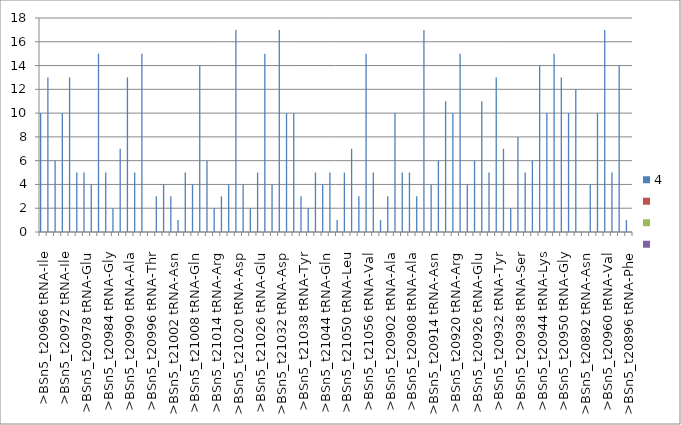
| Category | 4 | Series 1 | Series 2 | Series 3 |
|---|---|---|---|---|
| >BSn5_t20966 tRNA-Ile | 10 |  |  |  |
| >BSn5_t20968 tRNA-Ala | 13 |  |  |  |
| >BSn5_t20970 tRNA-Ser | 6 |  |  |  |
| >BSn5_t20972 tRNA-Ile | 10 |  |  |  |
| >BSn5_t20974 tRNA-Ala | 13 |  |  |  |
| >BSn5_t20976 tRNA-Met | 5 |  |  |  |
| >BSn5_t20978 tRNA-Glu | 5 |  |  |  |
| >BSn5_t20980 tRNA-Asn | 4 |  |  |  |
| >BSn5_t20982 tRNA-Thr | 15 |  |  |  |
| >BSn5_t20984 tRNA-Gly | 5 |  |  |  |
| >BSn5_t20986 tRNA-Arg | 2 |  |  |  |
| >BSn5_t20988 tRNA-Pro | 7 |  |  |  |
| >BSn5_t20990 tRNA-Ala | 13 |  |  |  |
| >BSn5_t20992 tRNA-Glu | 5 |  |  |  |
| >BSn5_t20994 tRNA-Val | 15 |  |  |  |
| >BSn5_t20996 tRNA-Thr | 0 |  |  |  |
| >BSn5_t20998 tRNA-Tyr | 3 |  |  |  |
| >BSn5_t21000 tRNA-Gln | 4 |  |  |  |
| >BSn5_t21002 tRNA-Asn | 3 |  |  |  |
| >BSn5_t21004 tRNA-Ser | 1 |  |  |  |
| >BSn5_t21006 tRNA-Glu | 5 |  |  |  |
| >BSn5_t21008 tRNA-Gln | 4 |  |  |  |
| >BSn5_t21010 tRNA-Lys | 14 |  |  |  |
| >BSn5_t21012 tRNA-Leu | 6 |  |  |  |
| >BSn5_t21014 tRNA-Arg | 2 |  |  |  |
| >BSn5_t21016 tRNA-Gly | 3 |  |  |  |
| >BSn5_t21018 tRNA-Met | 4 |  |  |  |
| >BSn5_t21020 tRNA-Asp | 17 |  |  |  |
| >BSn5_t21022 tRNA-Asn | 4 |  |  |  |
| >BSn5_t21024 tRNA-Ser | 2 |  |  |  |
| >BSn5_t21026 tRNA-Glu | 5 |  |  |  |
| >BSn5_t21028 tRNA-Val | 15 |  |  |  |
| >BSn5_t21030 tRNA-Met | 4 |  |  |  |
| >BSn5_t21032 tRNA-Asp | 17 |  |  |  |
| >BSn5_t21034 tRNA-Phe | 10 |  |  |  |
| >BSn5_t21036 tRNA-Thr | 10 |  |  |  |
| >BSn5_t21038 tRNA-Tyr | 3 |  |  |  |
| >BSn5_t21040 tRNA-Trp | 2 |  |  |  |
| >BSn5_t21042 tRNA-His | 5 |  |  |  |
| >BSn5_t21044 tRNA-Gln | 4 |  |  |  |
| >BSn5_t21046 tRNA-Gly | 5 |  |  |  |
| >BSn5_t21048 tRNA-Cys | 1 |  |  |  |
| >BSn5_t21050 tRNA-Leu | 5 |  |  |  |
| >BSn5_t21052 tRNA-Leu | 7 |  |  |  |
| >BSn5_t21054 tRNA-Gly | 3 |  |  |  |
| >BSn5_t21056 tRNA-Val | 15 |  |  |  |
| >BSn5_t20898 tRNA-Gln | 5 |  |  |  |
| >BSn5_t20900 tRNA-Ile | 1 |  |  |  |
| >BSn5_t20902 tRNA-Ala | 3 |  |  |  |
| >BSn5_t20904 tRNA-Ser | 10 |  |  |  |
| >BSn5_t20906 tRNA-Ile | 5 |  |  |  |
| >BSn5_t20908 tRNA-Ala | 5 |  |  |  |
| >BSn5_t20910 tRNA-Met | 3 |  |  |  |
| >BSn5_t20912 tRNA-Glu | 17 |  |  |  |
| >BSn5_t20914 tRNA-Asn | 4 |  |  |  |
| >BSn5_t20916 tRNA-Thr | 6 |  |  |  |
| >BSn5_t20918 tRNA-Gly | 11 |  |  |  |
| >BSn5_t20920 tRNA-Arg | 10 |  |  |  |
| >BSn5_t20922 tRNA-Pro | 15 |  |  |  |
| >BSn5_t20924 tRNA-Ala | 4 |  |  |  |
| >BSn5_t20926 tRNA-Glu | 6 |  |  |  |
| >BSn5_t20928 tRNA-Val | 11 |  |  |  |
| >BSn5_t20930 tRNA-Thr | 5 |  |  |  |
| >BSn5_t20932 tRNA-Tyr | 13 |  |  |  |
| >BSn5_t20934 tRNA-Gln | 7 |  |  |  |
| >BSn5_t20936 tRNA-Asn | 2 |  |  |  |
| >BSn5_t20938 tRNA-Ser | 8 |  |  |  |
| >BSn5_t20940 tRNA-Glu | 5 |  |  |  |
| >BSn5_t20942 tRNA-Gln | 6 |  |  |  |
| >BSn5_t20944 tRNA-Lys | 14 |  |  |  |
| >BSn5_t20946 tRNA-Leu | 10 |  |  |  |
| >BSn5_t20948 tRNA-Arg | 15 |  |  |  |
| >BSn5_t20950 tRNA-Gly | 13 |  |  |  |
| >BSn5_t20952 tRNA-Met | 10 |  |  |  |
| >BSn5_t20954 tRNA-Asp | 12 |  |  |  |
| >BSn5_t20892 tRNA-Asn | 0 |  |  |  |
| >BSn5_t20956 tRNA-Ser | 4 |  |  |  |
| >BSn5_t20958 tRNA-Glu | 10 |  |  |  |
| >BSn5_t20960 tRNA-Val | 17 |  |  |  |
| >BSn5_t20962 tRNA-Met | 5 |  |  |  |
| >BSn5_t20964 tRNA-Asp | 14 |  |  |  |
| >BSn5_t20896 tRNA-Phe | 1 |  |  |  |